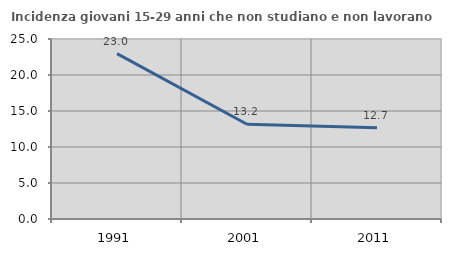
| Category | Incidenza giovani 15-29 anni che non studiano e non lavorano  |
|---|---|
| 1991.0 | 22.973 |
| 2001.0 | 13.158 |
| 2011.0 | 12.69 |